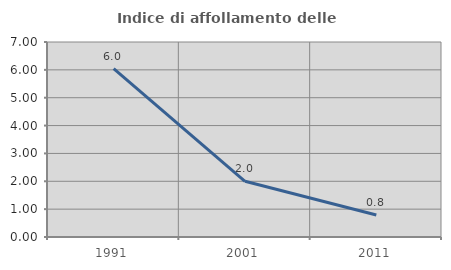
| Category | Indice di affollamento delle abitazioni  |
|---|---|
| 1991.0 | 6.047 |
| 2001.0 | 2 |
| 2011.0 | 0.789 |